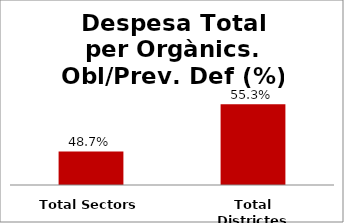
| Category | Series 0 |
|---|---|
| Total Sectors | 0.487 |
| Total Districtes | 0.553 |